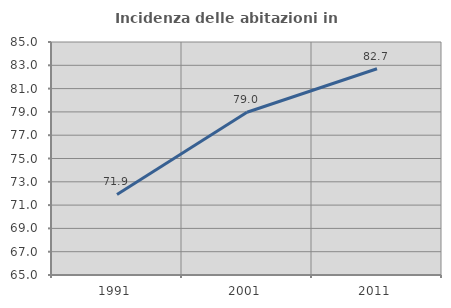
| Category | Incidenza delle abitazioni in proprietà  |
|---|---|
| 1991.0 | 71.912 |
| 2001.0 | 78.973 |
| 2011.0 | 82.702 |